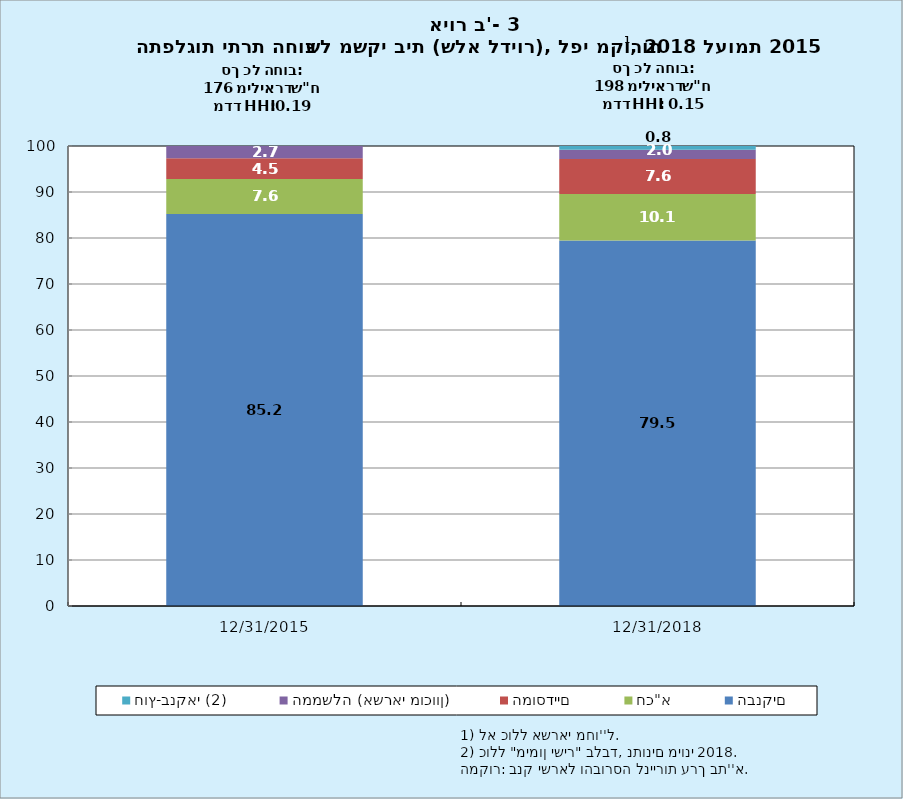
| Category | הבנקים | חכ"א | המוסדיים | הממשלה (אשראי מוכוון) | חוץ-בנקאי (2) |
|---|---|---|---|---|---|
| 12/31/15 | 85.218 | 7.607 | 4.515 | 2.66 | 0 |
| 12/31/18 | 79.472 | 10.106 | 7.61 | 1.993 | 0.819 |